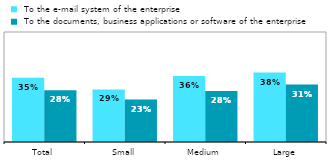
| Category |  To the e-mail system of the enterprise |  To the documents, business applications or software of the enterprise |
|---|---|---|
| Total | 0.35 | 0.282 |
| Small | 0.287 | 0.232 |
| Medium | 0.36 | 0.278 |
| Large | 0.379 | 0.314 |